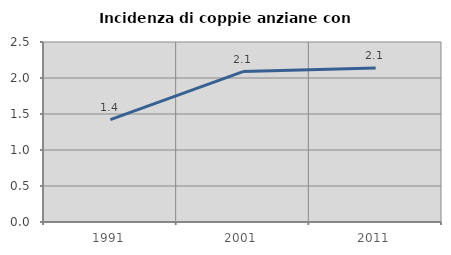
| Category | Incidenza di coppie anziane con figli |
|---|---|
| 1991.0 | 1.423 |
| 2001.0 | 2.089 |
| 2011.0 | 2.138 |